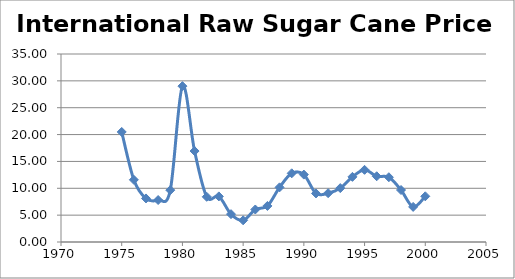
| Category | International Raw Sugar Cane Price |
|---|---|
| 1975.0 | 20.486 |
| 1976.0 | 11.579 |
| 1977.0 | 8.11 |
| 1978.0 | 7.816 |
| 1979.0 | 9.655 |
| 1980.0 | 29.015 |
| 1981.0 | 16.933 |
| 1982.0 | 8.416 |
| 1983.0 | 8.488 |
| 1984.0 | 5.182 |
| 1985.0 | 4.038 |
| 1986.0 | 6.051 |
| 1987.0 | 6.714 |
| 1988.0 | 10.173 |
| 1989.0 | 12.79 |
| 1990.0 | 12.548 |
| 1991.0 | 9.041 |
| 1992.0 | 9.091 |
| 1993.0 | 10.034 |
| 1994.0 | 12.127 |
| 1995.0 | 13.435 |
| 1996.0 | 12.239 |
| 1997.0 | 12.058 |
| 1998.0 | 9.681 |
| 1999.0 | 6.535 |
| 2000.0 | 8.508 |